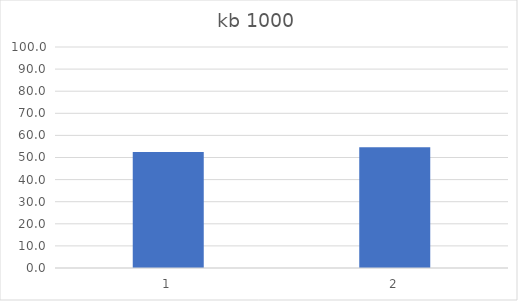
| Category | Series 0 |
|---|---|
| 0 | 52.463 |
| 1 | 54.583 |